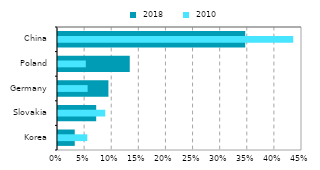
| Category |  2018 |
|---|---|
| Korea | 0.031 |
| Slovakia | 0.07 |
| Germany | 0.093 |
| Poland | 0.132 |
| China | 0.345 |